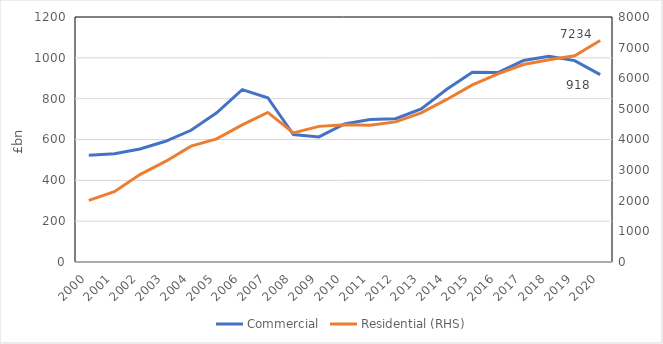
| Category | Commercial |
|---|---|
| 2000.0 | 522.537 |
| 2001.0 | 529.805 |
| 2002.0 | 553.575 |
| 2003.0 | 591.237 |
| 2004.0 | 645.263 |
| 2005.0 | 730.665 |
| 2006.0 | 844.531 |
| 2007.0 | 804.699 |
| 2008.0 | 624.53 |
| 2009.0 | 612.505 |
| 2010.0 | 675.93 |
| 2011.0 | 697.659 |
| 2012.0 | 701.568 |
| 2013.0 | 749.965 |
| 2014.0 | 845.932 |
| 2015.0 | 929.721 |
| 2016.0 | 928.025 |
| 2017.0 | 986.642 |
| 2018.0 | 1007.407 |
| 2019.0 | 986.239 |
| 2020.0 | 917.854 |